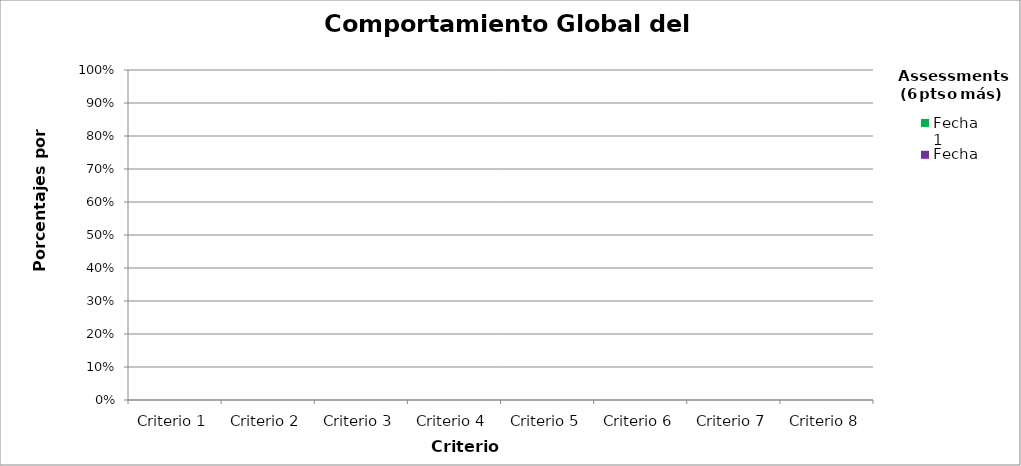
| Category | Fecha 1 | Fecha 2 |
|---|---|---|
| Criterio 1 | 0 | 0 |
| Criterio 2 | 0 | 0 |
| Criterio 3 | 0 | 0 |
| Criterio 4 | 0 | 0 |
| Criterio 5 | 0 | 0 |
| Criterio 6 | 0 | 0 |
| Criterio 7 | 0 | 0 |
| Criterio 8 | 0 | 0 |